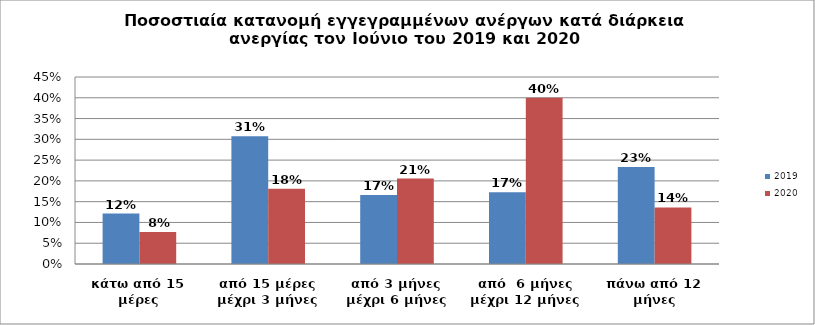
| Category | 2019 | 2020 |
|---|---|---|
| κάτω από 15 μέρες | 0.121 | 0.077 |
| από 15 μέρες μέχρι 3 μήνες | 0.307 | 0.181 |
| από 3 μήνες μέχρι 6 μήνες | 0.166 | 0.206 |
| από  6 μήνες μέχρι 12 μήνες | 0.172 | 0.4 |
| πάνω από 12 μήνες | 0.233 | 0.136 |